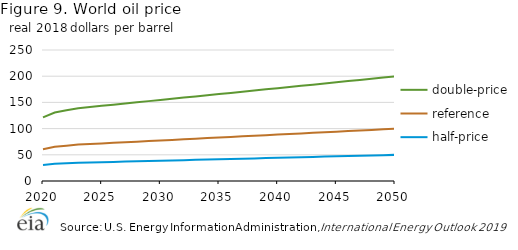
| Category | double-price | reference  | half-price |
|---|---|---|---|
| 2020 | 121.338 | 60.669 | 30.335 |
| 2021 | 130.81 | 65.405 | 32.703 |
| 2022 | 134.881 | 67.44 | 33.72 |
| 2023 | 138.952 | 69.476 | 34.738 |
| 2024 | 141.199 | 70.599 | 35.3 |
| 2025 | 143.446 | 71.723 | 35.861 |
| 2026 | 145.693 | 72.846 | 36.423 |
| 2027 | 147.94 | 73.97 | 36.985 |
| 2028 | 150.187 | 75.093 | 37.547 |
| 2029 | 152.434 | 76.217 | 38.108 |
| 2030 | 154.681 | 77.34 | 38.67 |
| 2031 | 156.928 | 78.464 | 39.232 |
| 2032 | 159.175 | 79.587 | 39.794 |
| 2033 | 161.422 | 80.711 | 40.355 |
| 2034 | 163.669 | 81.834 | 40.917 |
| 2035 | 165.916 | 82.958 | 41.479 |
| 2036 | 168.163 | 84.081 | 42.041 |
| 2037 | 170.41 | 85.205 | 42.602 |
| 2038 | 172.657 | 86.328 | 43.164 |
| 2039 | 174.904 | 87.452 | 43.726 |
| 2040 | 177.151 | 88.575 | 44.288 |
| 2041 | 179.398 | 89.699 | 44.849 |
| 2042 | 181.645 | 90.822 | 45.411 |
| 2043 | 183.892 | 91.946 | 45.973 |
| 2044 | 186.139 | 93.069 | 46.535 |
| 2045 | 188.386 | 94.193 | 47.096 |
| 2046 | 190.633 | 95.316 | 47.658 |
| 2047 | 192.88 | 96.44 | 48.22 |
| 2048 | 195.127 | 97.563 | 48.782 |
| 2049 | 197.374 | 98.687 | 49.343 |
| 2050 | 199.621 | 99.81 | 49.905 |